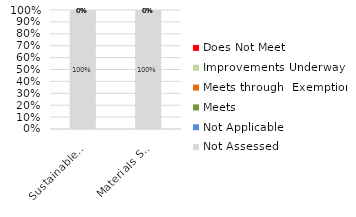
| Category | Not Assessed | Not Applicable | Meets | Meets through  Exemption | Improvements Underway | Does Not Meet |
|---|---|---|---|---|---|---|
| Sustainable Sites | 1 | 0 | 0 | 0 | 0 | 0 |
| Materials Selection | 1 | 0 | 0 | 0 | 0 | 0 |